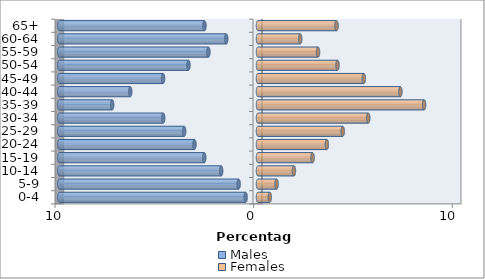
| Category | Males | Females |
|---|---|---|
| 0-4 | -0.622 | 0.591 |
| 5-9 | -0.974 | 0.936 |
| 10-14 | -1.854 | 1.807 |
| 15-19 | -2.705 | 2.747 |
| 20-24 | -3.198 | 3.467 |
| 25-29 | -3.717 | 4.264 |
| 30-34 | -4.77 | 5.55 |
| 35-39 | -7.34 | 8.361 |
| 40-44 | -6.431 | 7.168 |
| 45-49 | -4.778 | 5.327 |
| 50-54 | -3.5 | 4.003 |
| 55-59 | -2.496 | 3.022 |
| 60-64 | -1.599 | 2.126 |
| 65+ | -2.694 | 3.954 |